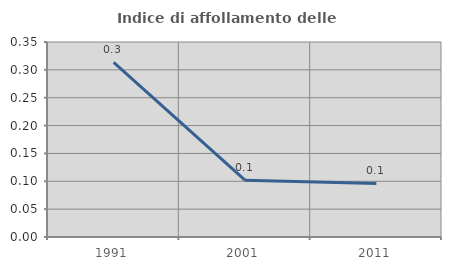
| Category | Indice di affollamento delle abitazioni  |
|---|---|
| 1991.0 | 0.313 |
| 2001.0 | 0.102 |
| 2011.0 | 0.096 |